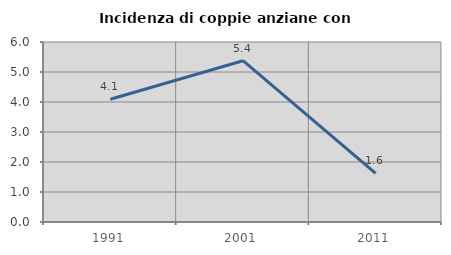
| Category | Incidenza di coppie anziane con figli |
|---|---|
| 1991.0 | 4.094 |
| 2001.0 | 5.376 |
| 2011.0 | 1.622 |